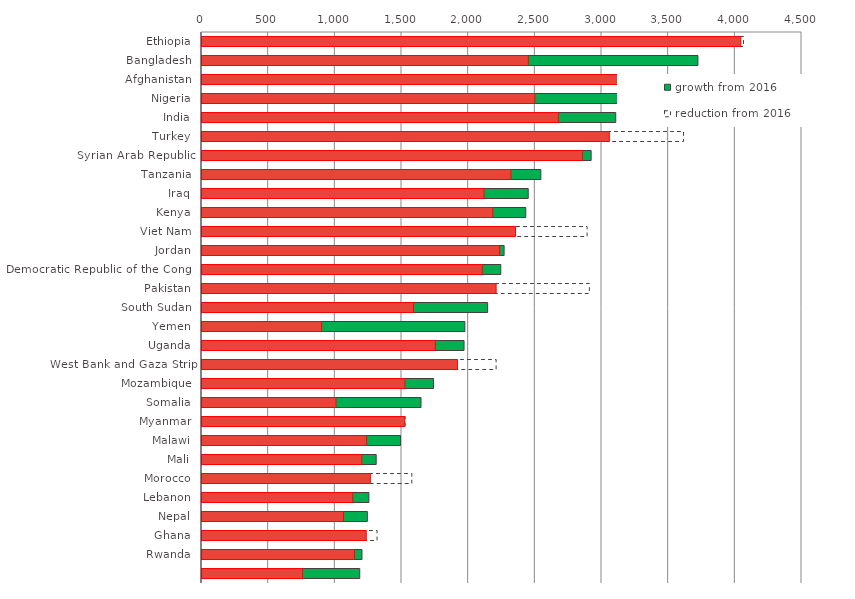
| Category | growth from 2016 | reduction from 2016 | Series 0 |
|---|---|---|---|
| Ethiopia | 0 | 4061.2 | 4041.25 |
| Bangladesh | 3719.64 | 0 | 2447.39 |
| Afghanistan | 0 | 3958.27 | 3662.46 |
| Nigeria | 3306.36 | 0 | 2496.23 |
| India | 3103.07 | 0 | 2672.53 |
| Turkey | 0 | 3611.67 | 3055.1 |
| Syrian Arab Republic | 2918.63 | 0 | 2853.46 |
| Tanzania | 2541.5 | 0 | 2316.68 |
| Iraq | 2446.8 | 0 | 2114.84 |
| Kenya | 2428.3 | 0 | 2181.53 |
| Viet Nam | 0 | 2888.29 | 2351.68 |
| Jordan | 2265.92 | 0 | 2232.58 |
| Democratic Republic of the Congo | 2240.93 | 0 | 2101.81 |
| Pakistan | 0 | 2905.36 | 2205.96 |
| South Sudan | 2142.27 | 0 | 1586.44 |
| Yemen | 1971.42 | 0 | 897.57 |
| Uganda | 1965.39 | 0 | 1749.2 |
| West Bank and Gaza Strip | 0 | 2205.92 | 1916.01 |
| Mozambique | 1736.46 | 0 | 1521.59 |
| Somalia | 1642.69 | 0 | 1005.36 |
| Myanmar | 0 | 1523.86 | 1520.51 |
| Malawi | 1488.53 | 0 | 1234.83 |
| Mali | 1306.46 | 0 | 1198.56 |
| Morocco | 0 | 1573.77 | 1262.42 |
| Lebanon | 1251.72 | 0 | 1130.82 |
| Nepal | 1240.18 | 0 | 1061.04 |
| Ghana | 0 | 1312.86 | 1231.84 |
| Rwanda | 1199.89 | 0 | 1143.9 |